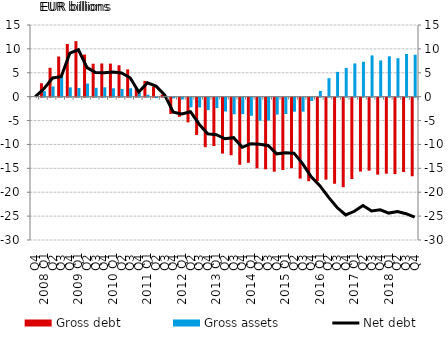
| Category | Gross debt | Gross assets |
|---|---|---|
| Q4 | 0 | 0 |
| 2008 Q1 | 2.805 | 1.155 |
| Q2 | 6.047 | 2.144 |
| Q3 | 8.406 | 4.231 |
| Q4 | 11.042 | 1.944 |
| 2009 Q1 | 11.619 | 1.806 |
| Q2 | 8.818 | 2.746 |
| Q3 | 6.896 | 1.845 |
| Q4 | 6.949 | 1.95 |
| 2010 Q1 | 6.917 | 1.755 |
| Q2 | 6.567 | 1.624 |
| Q3 | 5.717 | 1.759 |
| Q4 | 1.77 | 0.814 |
| 2011 Q1 | 3.302 | 0.409 |
| Q2 | 2.097 | -0.111 |
| Q3 | 0.433 | 0.067 |
| Q4 | -3.394 | -0.148 |
| 2012 Q1 | -4 | -0.387 |
| Q2 | -5.171 | -2.014 |
| Q3 | -7.808 | -2.044 |
| Q4 | -10.358 | -2.605 |
| 2013 Q1 | -10.129 | -2.176 |
| Q2 | -11.7 | -2.894 |
| Q3 | -12.051 | -3.475 |
| Q4 | -14.044 | -3.451 |
| 2014 Q1 | -13.623 | -3.789 |
| Q2 | -14.796 | -4.82 |
| Q3 | -14.997 | -4.797 |
| Q4 | -15.49 | -3.532 |
| 2015 Q1 | -15.157 | -3.419 |
| Q2 | -14.758 | -2.933 |
| Q3 | -16.939 | -2.933 |
| Q4 | -17.484 | -0.69 |
| 2016 Q1 | -17.44 | 1.197 |
| Q2 | -17.159 | 3.873 |
| Q3 | -18.021 | 5.187 |
| Q4 | -18.744 | 6.014 |
| 2017 Q1 | -17.034 | 6.951 |
| Q2 | -15.468 | 7.303 |
| Q3 | -15.285 | 8.635 |
| Q4 | -16.111 | 7.581 |
| 2018 Q1 | -15.914 | 8.452 |
| Q2 | -15.999 | 8.047 |
| Q3 | -15.559 | 8.936 |
| Q4 | -16.45 | 8.777 |